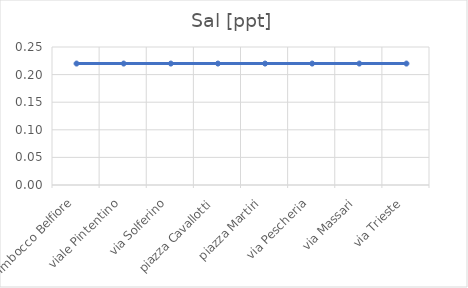
| Category | Sal [ppt] |
|---|---|
| Imbocco Belfiore | 0.22 |
| viale Pintentino | 0.22 |
| via Solferino | 0.22 |
| piazza Cavallotti | 0.22 |
| piazza Martiri | 0.22 |
| via Pescheria | 0.22 |
| via Massari | 0.22 |
| via Trieste | 0.22 |